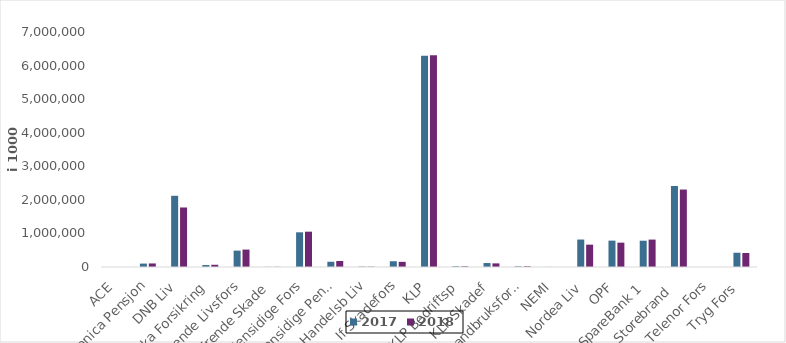
| Category | 2017 | 2018 |
|---|---|---|
| ACE | 0 | 0 |
| Danica Pensjon | 101335.864 | 105522.829 |
| DNB Liv | 2121279 | 1773028 |
| Eika Forsikring | 58168 | 66623 |
| Frende Livsfors | 487767 | 518678 |
| Frende Skade | 4414 | 4814 |
| Gjensidige Fors | 1033220 | 1052245 |
| Gjensidige Pensj | 155987 | 178625 |
| Handelsb Liv | 11269 | 10248 |
| If Skadefors | 171195.791 | 153678.716 |
| KLP | 6288898.735 | 6307422.436 |
| KLP Bedriftsp | 21438 | 20618 |
| KLP Skadef | 117684.757 | 107643.077 |
| Landbruksfors. | 19934 | 21888.015 |
| NEMI | 2312 | 620 |
| Nordea Liv | 817756.212 | 665744.159 |
| OPF | 785297 | 725316 |
| SpareBank 1 | 782973.222 | 816522.198 |
| Storebrand  | 2413053.41 | 2307542.627 |
| Telenor Fors | 0 | 0 |
| Tryg Fors | 424578.353 | 417186 |